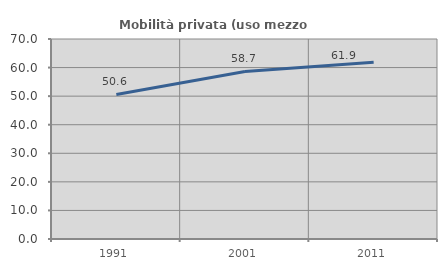
| Category | Mobilità privata (uso mezzo privato) |
|---|---|
| 1991.0 | 50.607 |
| 2001.0 | 58.657 |
| 2011.0 | 61.867 |